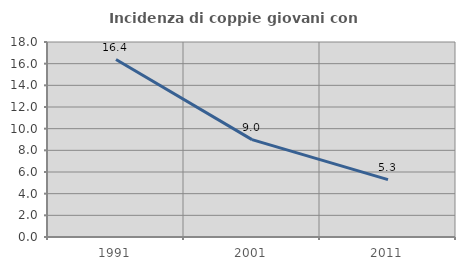
| Category | Incidenza di coppie giovani con figli |
|---|---|
| 1991.0 | 16.381 |
| 2001.0 | 8.989 |
| 2011.0 | 5.298 |